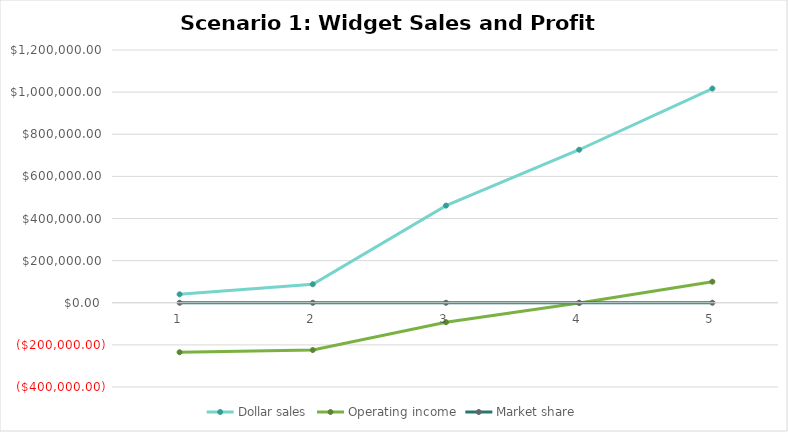
| Category | Dollar sales | Operating income | Market share |
|---|---|---|---|
| 0 | 40000 | -235000 | 0.001 |
| 1 | 87852.791 | -224555.203 | 0.002 |
| 2 | 461227.153 | -92264.817 | 0.008 |
| 3 | 726432.767 | -769.462 | 0.011 |
| 4 | 1017005.873 | 100000 | 0.014 |